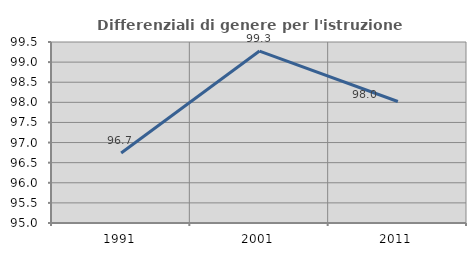
| Category | Differenziali di genere per l'istruzione superiore |
|---|---|
| 1991.0 | 96.739 |
| 2001.0 | 99.274 |
| 2011.0 | 98.02 |